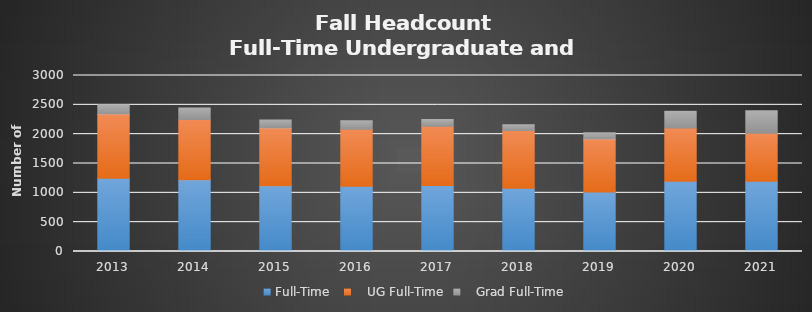
| Category | Full-Time  |    UG Full-Time |    Grad Full-Time |
|---|---|---|---|
| 2013.0 | 1248 | 1096 | 152 |
| 2014.0 | 1224 | 1028 | 196 |
| 2015.0 | 1121 | 986 | 135 |
| 2016.0 | 1114 | 970 | 144 |
| 2017.0 | 1124 | 1009 | 115 |
| 2018.0 | 1080 | 982 | 98 |
| 2019.0 | 1013 | 906 | 107 |
| 2020.0 | 1196 | 907 | 289 |
| 2021.0 | 1199 | 815 | 384 |